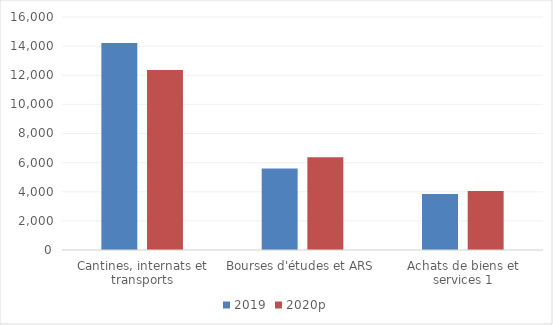
| Category | 2019 | 2020p |
|---|---|---|
| Cantines, internats et transports | 14216.21 | 12356.539 |
| Bourses d'études et ARS | 5593.353 | 6364.56 |
| Achats de biens et services 1 | 3841.693 | 4058.466 |